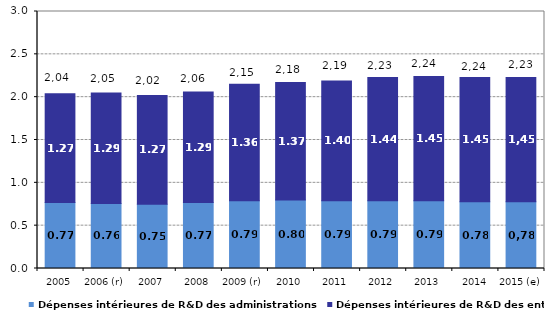
| Category | Dépenses intérieures de R&D des administrations | Dépenses intérieures de R&D des entreprises  |
|---|---|---|
| 2005 | 0.77 | 1.27 |
| 2006 (r) | 0.76 | 1.29 |
| 2007 | 0.75 | 1.27 |
| 2008 | 0.77 | 1.29 |
| 2009 (r) | 0.79 | 1.36 |
| 2010 | 0.8 | 1.37 |
| 2011 | 0.79 | 1.4 |
| 2012 | 0.79 | 1.44 |
| 2013 | 0.79 | 1.45 |
| 2014 (sd) | 0.78 | 1.45 |
| 2015 (e) | 0.78 | 1.45 |